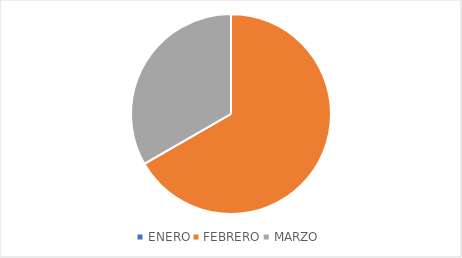
| Category | Series 0 |
|---|---|
| ENERO | 0 |
| FEBRERO | 2 |
| MARZO | 1 |